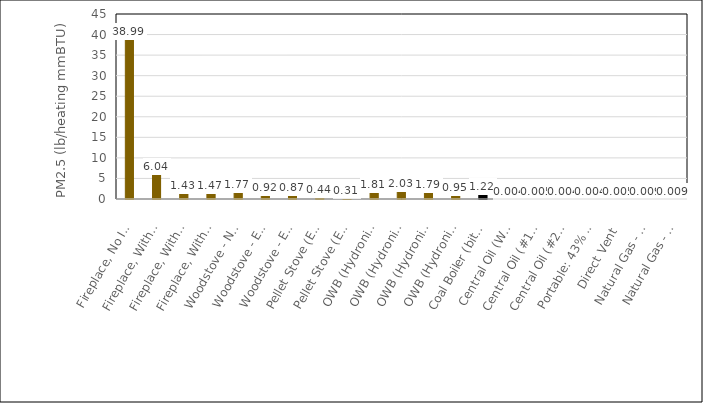
| Category | Series 0 |
|---|---|
| Fireplace, No Insert | 38.994 |
| Fireplace, With Insert - Non-EPA Certified | 6.035 |
| Fireplace, With Insert - EPA Certified Non-Catalytic | 1.434 |
| Fireplace, With Insert - EPA Certified Catalytic | 1.465 |
| Woodstove - Non-EPA Certified | 1.774 |
| Woodstove - EPA Certified Non-Catalytic | 0.919 |
| Woodstove - EPA Certified Catalytic | 0.868 |
| Pellet Stove (Exempt) | 0.436 |
| Pellet Stove (EPA Certified) | 0.313 |
| OWB (Hydronic Heater) - 80/20 Unqual/Phase 2 Wtd | 1.811 |
| OWB (Hydronic Heater) - Unqualified | 2.027 |
| OWB (Hydronic Heater) - Phase 1 | 1.786 |
| OWB (Hydronic Heater) - Phase 2 | 0.948 |
| Coal Boiler (bituminous/subbituminous, hand-fed) | 1.222 |
| Central Oil (Weighted # 1 & #2), Residential | 0.004 |
| Central Oil (#1 distillate), Residential | 0.005 |
| Central Oil (#2 distillate), Residential | 0.004 |
| Portable: 43% Kerosene & 57% Fuel Oil | 0.004 |
| Direct Vent | 0.005 |
| Natural Gas - Residential | 0.009 |
| Natural Gas - Commercial, small uncontrolled | 0.009 |